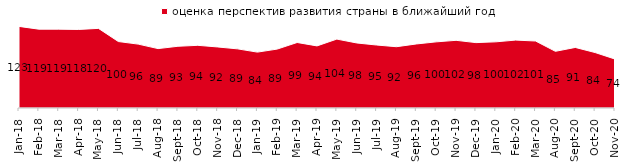
| Category | оценка перспектив развития страны в ближайший год |
|---|---|
| 2018-01-01 | 122.9 |
| 2018-02-01 | 118.7 |
| 2018-03-01 | 118.7 |
| 2018-04-01 | 118.3 |
| 2018-05-01 | 119.9 |
| 2018-06-01 | 100.1 |
| 2018-07-01 | 96.2 |
| 2018-08-01 | 89.45 |
| 2018-09-01 | 92.95 |
| 2018-10-01 | 94.4 |
| 2018-11-01 | 91.916 |
| 2018-12-01 | 89.05 |
| 2019-01-01 | 84.15 |
| 2019-02-01 | 88.75 |
| 2019-03-01 | 98.657 |
| 2019-04-01 | 93.515 |
| 2019-05-01 | 103.764 |
| 2019-06-01 | 97.955 |
| 2019-07-01 | 94.851 |
| 2019-08-01 | 92.308 |
| 2019-09-01 | 96.436 |
| 2019-10-01 | 99.604 |
| 2019-11-01 | 101.931 |
| 2019-12-01 | 98.465 |
| 2020-01-01 | 99.653 |
| 2020-02-01 | 102.277 |
| 2020-03-01 | 100.892 |
| 2020-08-01 | 85.353 |
| 2020-09-01 | 91.19 |
| 2020-10-01 | 83.508 |
| 2020-11-01 | 73.7 |